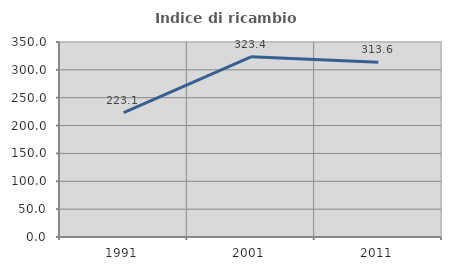
| Category | Indice di ricambio occupazionale  |
|---|---|
| 1991.0 | 223.077 |
| 2001.0 | 323.404 |
| 2011.0 | 313.636 |